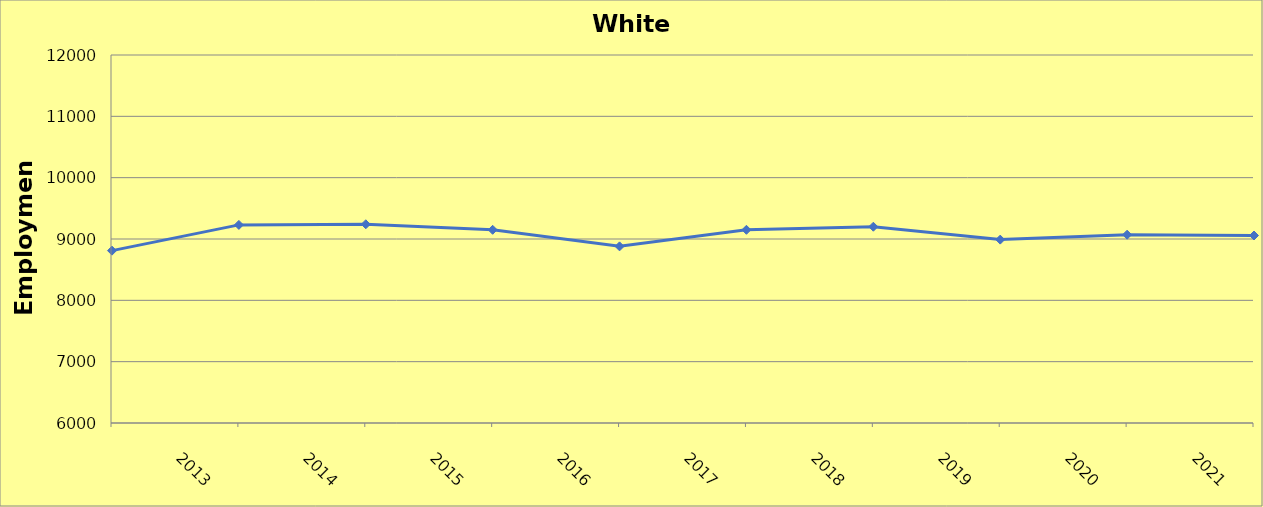
| Category | White County |
|---|---|
| 2013.0 | 8810 |
| 2014.0 | 9230 |
| 2015.0 | 9240 |
| 2016.0 | 9150 |
| 2017.0 | 8880 |
| 2018.0 | 9150 |
| 2019.0 | 9200 |
| 2020.0 | 8990 |
| 2021.0 | 9070 |
| 2022.0 | 9057 |